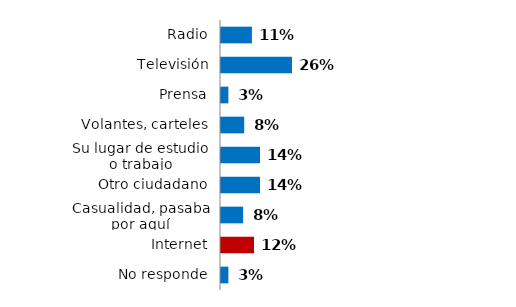
| Category | Series 0 |
|---|---|
| Radio | 0.113 |
| Televisión | 0.26 |
| Prensa | 0.027 |
| Volantes, carteles | 0.085 |
| Su lugar de estudio o trabajo | 0.143 |
| Otro ciudadano | 0.143 |
| Casualidad, pasaba por aquí | 0.081 |
| Internet | 0.121 |
| No responde | 0.027 |